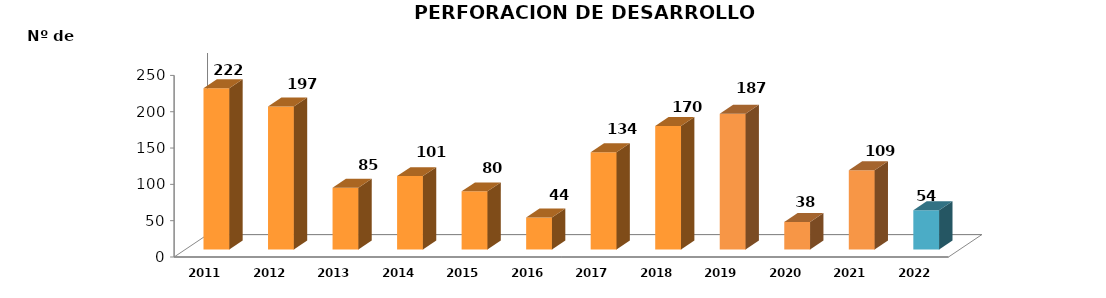
| Category | Series 0 |
|---|---|
| 2011.0 | 222 |
| 2012.0 | 197 |
| 2013.0 | 85 |
| 2014.0 | 101 |
| 2015.0 | 80 |
| 2016.0 | 44 |
| 2017.0 | 134 |
| 2018.0 | 170 |
| 2019.0 | 187 |
| 2020.0 | 38 |
| 2021.0 | 109 |
| 2022.0 | 54 |